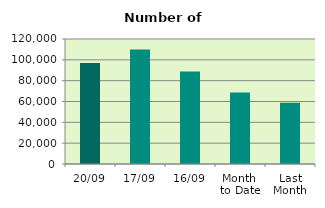
| Category | Series 0 |
|---|---|
| 20/09 | 96920 |
| 17/09 | 109802 |
| 16/09 | 88914 |
| Month 
to Date | 68752.143 |
| Last
Month | 58874.818 |